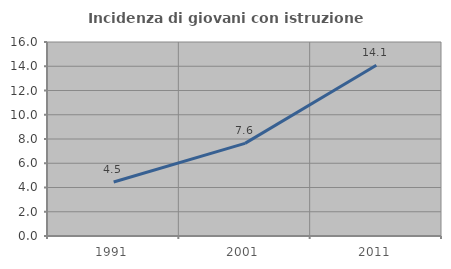
| Category | Incidenza di giovani con istruzione universitaria |
|---|---|
| 1991.0 | 4.451 |
| 2001.0 | 7.64 |
| 2011.0 | 14.08 |